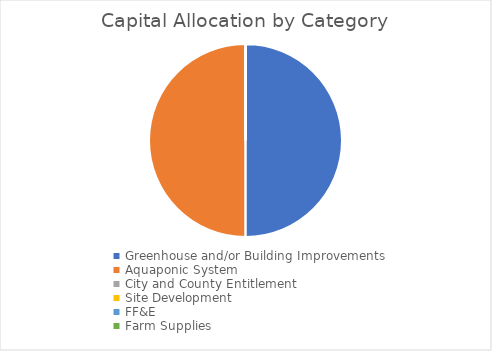
| Category | Series 0 |
|---|---|
| Greenhouse and/or Building Improvements | 50000 |
| Aquaponic System | 50000 |
| City and County Entitlement | 0 |
| Site Development | 0 |
| FF&E | 0 |
| Farm Supplies | 0 |